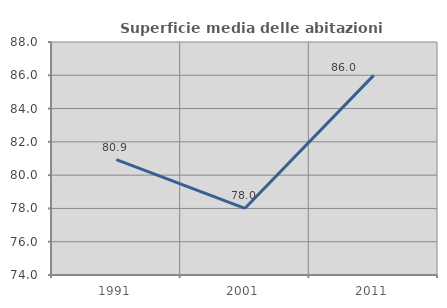
| Category | Superficie media delle abitazioni occupate |
|---|---|
| 1991.0 | 80.928 |
| 2001.0 | 78.006 |
| 2011.0 | 85.997 |